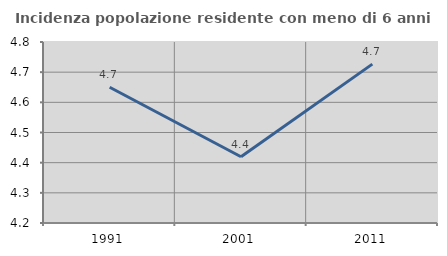
| Category | Incidenza popolazione residente con meno di 6 anni |
|---|---|
| 1991.0 | 4.65 |
| 2001.0 | 4.42 |
| 2011.0 | 4.727 |